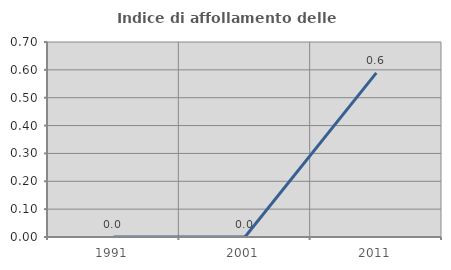
| Category | Indice di affollamento delle abitazioni  |
|---|---|
| 1991.0 | 0 |
| 2001.0 | 0 |
| 2011.0 | 0.589 |